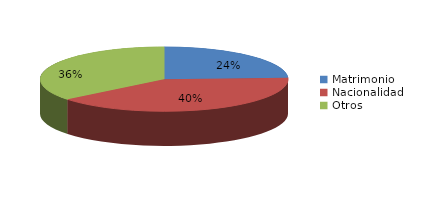
| Category | Series 0 |
|---|---|
| Matrimonio | 1371 |
| Nacionalidad | 2255 |
| Otros | 2025 |